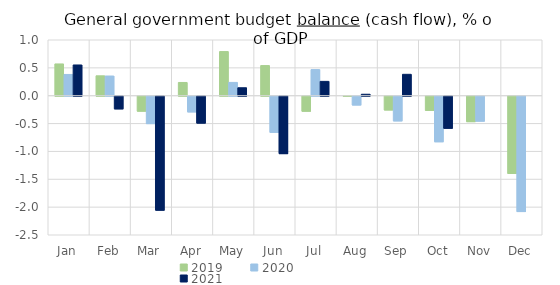
| Category | 2019 | 2020 | 2021 |
|---|---|---|---|
| Jan | 0.57 | 0.381 | 0.552 |
| Feb | 0.357 | 0.354 | -0.227 |
| Mar | -0.269 | -0.492 | -2.045 |
| Apr | 0.238 | -0.282 | -0.483 |
| May | 0.792 | 0.239 | 0.143 |
| Jun | 0.541 | -0.648 | -1.031 |
| Jul | -0.269 | 0.469 | 0.257 |
| Aug | -0.001 | -0.158 | 0.026 |
| Sep | -0.247 | -0.443 | 0.384 |
| Oct | -0.255 | -0.817 | -0.575 |
| Nov | -0.457 | -0.448 | 0 |
| Dec | -1.387 | -2.071 | 0 |